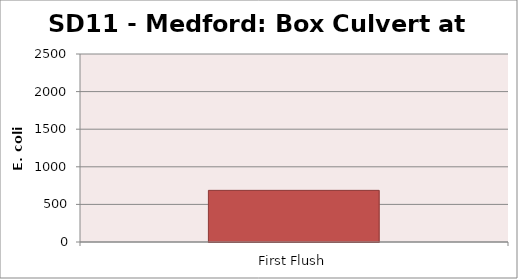
| Category | E. coli MPN |
|---|---|
| First Flush | 686.7 |